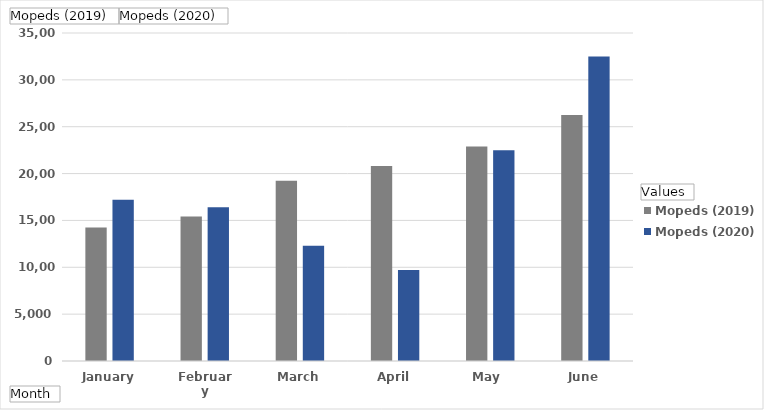
| Category | Mopeds (2019) | Mopeds (2020) |
|---|---|---|
| January | 14235 | 17214 |
| February | 15411 | 16415 |
| March | 19237 | 12299 |
| April | 20813 | 9701 |
| May  | 22897 | 22494 |
| June | 26257 | 32490 |